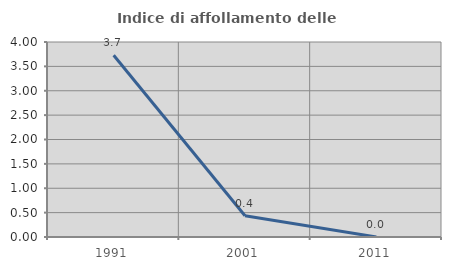
| Category | Indice di affollamento delle abitazioni  |
|---|---|
| 1991.0 | 3.727 |
| 2001.0 | 0.436 |
| 2011.0 | 0 |